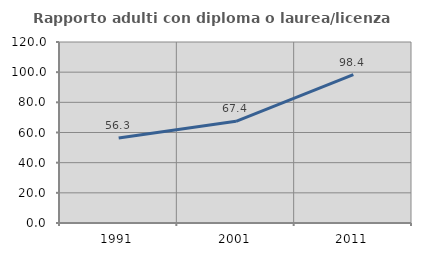
| Category | Rapporto adulti con diploma o laurea/licenza media  |
|---|---|
| 1991.0 | 56.303 |
| 2001.0 | 67.416 |
| 2011.0 | 98.438 |